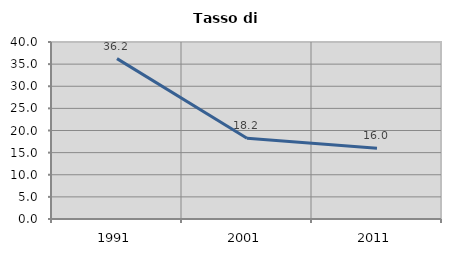
| Category | Tasso di disoccupazione   |
|---|---|
| 1991.0 | 36.249 |
| 2001.0 | 18.237 |
| 2011.0 | 16.014 |